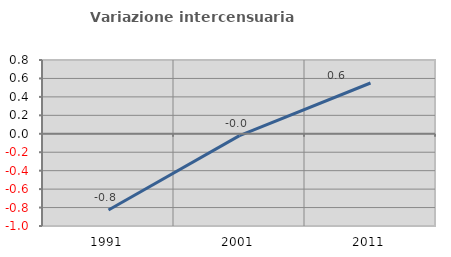
| Category | Variazione intercensuaria annua |
|---|---|
| 1991.0 | -0.826 |
| 2001.0 | -0.02 |
| 2011.0 | 0.551 |